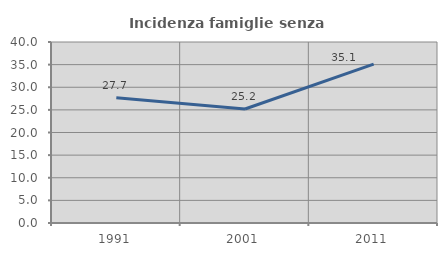
| Category | Incidenza famiglie senza nuclei |
|---|---|
| 1991.0 | 27.679 |
| 2001.0 | 25.185 |
| 2011.0 | 35.109 |